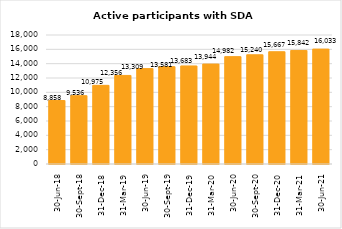
| Category | Active participants with SDA supports |
|---|---|
| 2018-06-30 | 8858 |
| 2018-09-30 | 9536 |
| 2018-12-31 | 10975 |
| 2019-03-31 | 12356 |
| 2019-06-30 | 13309 |
| 2019-09-30 | 13581 |
| 2019-12-31 | 13683 |
| 2020-03-31 | 13944 |
| 2020-06-30 | 14982 |
| 2020-09-30 | 15240 |
| 2020-12-31 | 15667 |
| 2021-03-31 | 15842 |
| 2021-06-30 | 16033 |